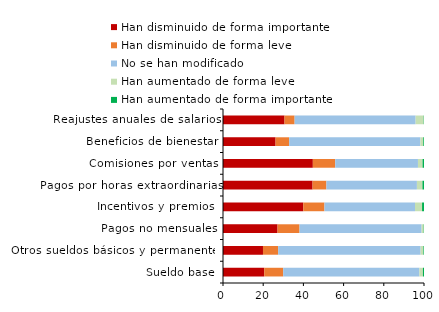
| Category | Han disminuido de forma importante | Han disminuido de forma leve | No se han modificado | Han aumentado de forma leve | Han aumentado de forma importante |
|---|---|---|---|---|---|
| Sueldo base | 20.513 | 9.447 | 67.746 | 1.754 | 0.54 |
| Otros sueldos básicos y permanentes | 19.888 | 7.563 | 70.868 | 1.401 | 0.28 |
| Pagos no mensuales | 27.136 | 10.945 | 60.72 | 1.049 | 0.15 |
| Incentivos y premios  | 39.936 | 10.543 | 45.048 | 3.514 | 0.958 |
| Pagos por horas extraordinarias | 44.564 | 6.891 | 45.023 | 2.757 | 0.766 |
| Comisiones por ventas | 44.7 | 11.131 | 41.166 | 2.297 | 0.707 |
| Beneficios de bienestar | 26.157 | 6.762 | 65.302 | 1.423 | 0.356 |
| Reajustes anuales de salarios | 30.603 | 5.029 | 60.201 | 4.023 | 0.144 |